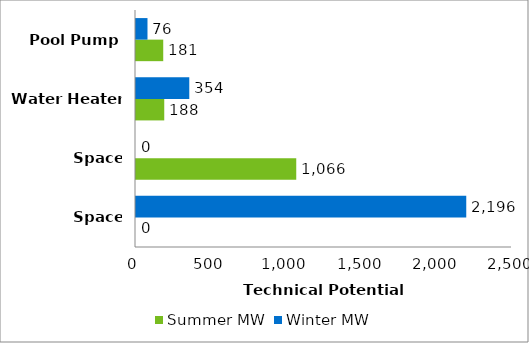
| Category | Summer MW | Winter MW |
|---|---|---|
| Space Heating | 0 | 2195.849 |
| Space Cooling | 1065.508 | 0 |
| Water Heater | 187.827 | 354.273 |
| Pool Pump | 181.081 | 76.38 |